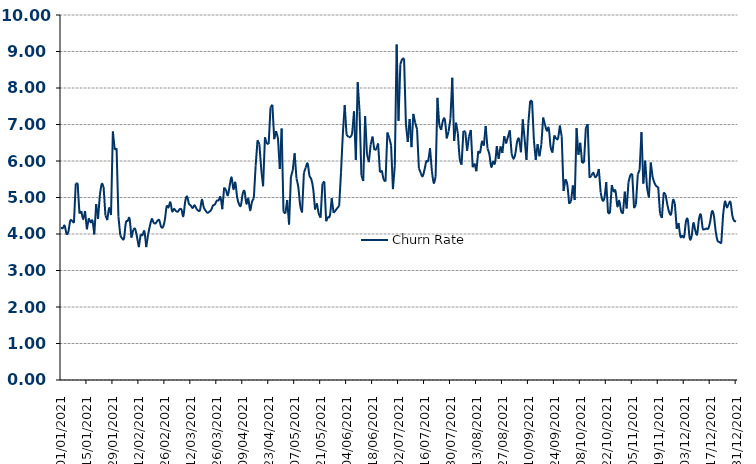
| Category | Churn Rate |
|---|---|
| 01/01/2021 | 4.17 |
| 02/01/2021 | 4.16 |
| 03/01/2021 | 4.23 |
| 04/01/2021 | 4.01 |
| 05/01/2021 | 4.06 |
| 06/01/2021 | 4.36 |
| 07/01/2021 | 4.36 |
| 08/01/2021 | 4.3 |
| 09/01/2021 | 5.38 |
| 10/01/2021 | 5.39 |
| 11/01/2021 | 4.56 |
| 12/01/2021 | 4.63 |
| 13/01/2021 | 4.4 |
| 14/01/2021 | 4.63 |
| 15/01/2021 | 4.13 |
| 16/01/2021 | 4.43 |
| 17/01/2021 | 4.32 |
| 18/01/2021 | 4.36 |
| 19/01/2021 | 3.99 |
| 20/01/2021 | 4.82 |
| 21/01/2021 | 4.41 |
| 22/01/2021 | 5.07 |
| 23/01/2021 | 5.37 |
| 24/01/2021 | 5.29 |
| 25/01/2021 | 4.51 |
| 26/01/2021 | 4.38 |
| 27/01/2021 | 4.71 |
| 28/01/2021 | 4.52 |
| 29/01/2021 | 6.81 |
| 30/01/2021 | 6.31 |
| 31/01/2021 | 6.35 |
| 01/02/2021 | 4.48 |
| 02/02/2021 | 3.96 |
| 03/02/2021 | 3.88 |
| 04/02/2021 | 3.88 |
| 05/02/2021 | 4.31 |
| 06/02/2021 | 4.36 |
| 07/02/2021 | 4.42 |
| 08/02/2021 | 3.9 |
| 09/02/2021 | 4.12 |
| 10/02/2021 | 4.14 |
| 11/02/2021 | 3.92 |
| 12/02/2021 | 3.64 |
| 13/02/2021 | 3.99 |
| 14/02/2021 | 3.97 |
| 15/02/2021 | 4.07 |
| 16/02/2021 | 3.64 |
| 17/02/2021 | 3.99 |
| 18/02/2021 | 4.23 |
| 19/02/2021 | 4.41 |
| 20/02/2021 | 4.31 |
| 21/02/2021 | 4.29 |
| 22/02/2021 | 4.36 |
| 23/02/2021 | 4.38 |
| 24/02/2021 | 4.2 |
| 25/02/2021 | 4.19 |
| 26/02/2021 | 4.38 |
| 27/02/2021 | 4.75 |
| 28/02/2021 | 4.73 |
| 01/03/2021 | 4.87 |
| 02/03/2021 | 4.62 |
| 03/03/2021 | 4.69 |
| 04/03/2021 | 4.63 |
| 05/03/2021 | 4.61 |
| 06/03/2021 | 4.68 |
| 07/03/2021 | 4.67 |
| 08/03/2021 | 4.49 |
| 09/03/2021 | 4.89 |
| 10/03/2021 | 5.03 |
| 11/03/2021 | 4.83 |
| 12/03/2021 | 4.78 |
| 13/03/2021 | 4.71 |
| 14/03/2021 | 4.79 |
| 15/03/2021 | 4.7 |
| 16/03/2021 | 4.64 |
| 17/03/2021 | 4.66 |
| 18/03/2021 | 4.94 |
| 19/03/2021 | 4.73 |
| 20/03/2021 | 4.64 |
| 21/03/2021 | 4.58 |
| 22/03/2021 | 4.61 |
| 23/03/2021 | 4.66 |
| 24/03/2021 | 4.78 |
| 25/03/2021 | 4.81 |
| 26/03/2021 | 4.91 |
| 27/03/2021 | 4.92 |
| 28/03/2021 | 5.01 |
| 29/03/2021 | 4.68 |
| 30/03/2021 | 5.27 |
| 31/03/2021 | 5.21 |
| 01/04/2021 | 5.06 |
| 02/04/2021 | 5.33 |
| 03/04/2021 | 5.55 |
| 04/04/2021 | 5.23 |
| 05/04/2021 | 5.41 |
| 06/04/2021 | 5.01 |
| 07/04/2021 | 4.82 |
| 08/04/2021 | 4.78 |
| 09/04/2021 | 5.1 |
| 10/04/2021 | 5.17 |
| 11/04/2021 | 4.83 |
| 12/04/2021 | 4.97 |
| 13/04/2021 | 4.65 |
| 14/04/2021 | 4.88 |
| 15/04/2021 | 4.98 |
| 16/04/2021 | 5.88 |
| 17/04/2021 | 6.57 |
| 18/04/2021 | 6.46 |
| 19/04/2021 | 5.79 |
| 20/04/2021 | 5.31 |
| 21/04/2021 | 6.65 |
| 22/04/2021 | 6.47 |
| 23/04/2021 | 6.47 |
| 24/04/2021 | 7.47 |
| 25/04/2021 | 7.54 |
| 26/04/2021 | 6.6 |
| 27/04/2021 | 6.82 |
| 28/04/2021 | 6.63 |
| 29/04/2021 | 5.78 |
| 30/04/2021 | 6.89 |
| 01/05/2021 | 4.61 |
| 02/05/2021 | 4.56 |
| 03/05/2021 | 4.93 |
| 04/05/2021 | 4.26 |
| 05/05/2021 | 5.56 |
| 06/05/2021 | 5.75 |
| 07/05/2021 | 6.21 |
| 08/05/2021 | 5.52 |
| 09/05/2021 | 5.28 |
| 10/05/2021 | 4.78 |
| 11/05/2021 | 4.59 |
| 12/05/2021 | 5.68 |
| 13/05/2021 | 5.82 |
| 14/05/2021 | 5.93 |
| 15/05/2021 | 5.6 |
| 16/05/2021 | 5.5 |
| 17/05/2021 | 5.24 |
| 18/05/2021 | 4.67 |
| 19/05/2021 | 4.84 |
| 20/05/2021 | 4.56 |
| 21/05/2021 | 4.45 |
| 22/05/2021 | 5.38 |
| 23/05/2021 | 5.44 |
| 24/05/2021 | 4.35 |
| 25/05/2021 | 4.47 |
| 26/05/2021 | 4.5 |
| 27/05/2021 | 4.98 |
| 28/05/2021 | 4.58 |
| 29/05/2021 | 4.64 |
| 30/05/2021 | 4.71 |
| 31/05/2021 | 4.77 |
| 01/06/2021 | 5.68 |
| 02/06/2021 | 6.74 |
| 03/06/2021 | 7.53 |
| 04/06/2021 | 6.72 |
| 05/06/2021 | 6.66 |
| 06/06/2021 | 6.66 |
| 07/06/2021 | 6.77 |
| 08/06/2021 | 7.36 |
| 09/06/2021 | 6.03 |
| 10/06/2021 | 8.16 |
| 11/06/2021 | 7.36 |
| 12/06/2021 | 5.61 |
| 13/06/2021 | 5.45 |
| 14/06/2021 | 7.23 |
| 15/06/2021 | 6.19 |
| 16/06/2021 | 5.97 |
| 17/06/2021 | 6.45 |
| 18/06/2021 | 6.67 |
| 19/06/2021 | 6.3 |
| 20/06/2021 | 6.33 |
| 21/06/2021 | 6.48 |
| 22/06/2021 | 5.69 |
| 23/06/2021 | 5.74 |
| 24/06/2021 | 5.5 |
| 25/06/2021 | 5.44 |
| 26/06/2021 | 6.78 |
| 27/06/2021 | 6.64 |
| 28/06/2021 | 6.43 |
| 29/06/2021 | 5.23 |
| 30/06/2021 | 5.87 |
| 01/07/2021 | 9.19 |
| 02/07/2021 | 7.1 |
| 03/07/2021 | 8.65 |
| 04/07/2021 | 8.8 |
| 05/07/2021 | 8.81 |
| 06/07/2021 | 7.01 |
| 07/07/2021 | 6.52 |
| 08/07/2021 | 7.15 |
| 09/07/2021 | 6.38 |
| 10/07/2021 | 7.29 |
| 11/07/2021 | 7.05 |
| 12/07/2021 | 6.87 |
| 13/07/2021 | 5.8 |
| 14/07/2021 | 5.67 |
| 15/07/2021 | 5.58 |
| 16/07/2021 | 5.76 |
| 17/07/2021 | 5.99 |
| 18/07/2021 | 6.01 |
| 19/07/2021 | 6.35 |
| 20/07/2021 | 5.72 |
| 21/07/2021 | 5.4 |
| 22/07/2021 | 5.57 |
| 23/07/2021 | 7.73 |
| 24/07/2021 | 6.98 |
| 25/07/2021 | 6.85 |
| 26/07/2021 | 7.11 |
| 27/07/2021 | 7.13 |
| 28/07/2021 | 6.62 |
| 29/07/2021 | 6.81 |
| 30/07/2021 | 7.16 |
| 31/07/2021 | 8.28 |
| 01/08/2021 | 6.55 |
| 02/08/2021 | 7.05 |
| 03/08/2021 | 6.76 |
| 04/08/2021 | 6.07 |
| 05/08/2021 | 5.9 |
| 06/08/2021 | 6.82 |
| 07/08/2021 | 6.81 |
| 08/08/2021 | 6.28 |
| 09/08/2021 | 6.67 |
| 10/08/2021 | 6.85 |
| 11/08/2021 | 5.83 |
| 12/08/2021 | 5.93 |
| 13/08/2021 | 5.72 |
| 14/08/2021 | 6.27 |
| 15/08/2021 | 6.24 |
| 16/08/2021 | 6.53 |
| 17/08/2021 | 6.42 |
| 18/08/2021 | 6.96 |
| 19/08/2021 | 6.34 |
| 20/08/2021 | 6.18 |
| 21/08/2021 | 5.84 |
| 22/08/2021 | 5.98 |
| 23/08/2021 | 5.94 |
| 24/08/2021 | 6.41 |
| 25/08/2021 | 6.06 |
| 26/08/2021 | 6.4 |
| 27/08/2021 | 6.22 |
| 28/08/2021 | 6.68 |
| 29/08/2021 | 6.48 |
| 30/08/2021 | 6.66 |
| 31/08/2021 | 6.84 |
| 01/09/2021 | 6.2 |
| 02/09/2021 | 6.06 |
| 03/09/2021 | 6.2 |
| 04/09/2021 | 6.54 |
| 05/09/2021 | 6.6 |
| 06/09/2021 | 6.24 |
| 07/09/2021 | 7.14 |
| 08/09/2021 | 6.6 |
| 09/09/2021 | 6.03 |
| 10/09/2021 | 7.03 |
| 11/09/2021 | 7.65 |
| 12/09/2021 | 7.65 |
| 13/09/2021 | 6.57 |
| 14/09/2021 | 6.03 |
| 15/09/2021 | 6.46 |
| 16/09/2021 | 6.13 |
| 17/09/2021 | 6.45 |
| 18/09/2021 | 7.19 |
| 19/09/2021 | 6.99 |
| 20/09/2021 | 6.83 |
| 21/09/2021 | 6.9 |
| 22/09/2021 | 6.39 |
| 23/09/2021 | 6.23 |
| 24/09/2021 | 6.7 |
| 25/09/2021 | 6.62 |
| 26/09/2021 | 6.62 |
| 27/09/2021 | 6.97 |
| 28/09/2021 | 6.67 |
| 29/09/2021 | 5.18 |
| 30/09/2021 | 5.5 |
| 01/10/2021 | 5.36 |
| 02/10/2021 | 4.83 |
| 03/10/2021 | 4.89 |
| 04/10/2021 | 5.33 |
| 05/10/2021 | 4.93 |
| 06/10/2021 | 6.9 |
| 07/10/2021 | 6.17 |
| 08/10/2021 | 6.5 |
| 09/10/2021 | 5.95 |
| 10/10/2021 | 5.96 |
| 11/10/2021 | 6.9 |
| 12/10/2021 | 7.01 |
| 13/10/2021 | 5.54 |
| 14/10/2021 | 5.6 |
| 15/10/2021 | 5.68 |
| 16/10/2021 | 5.56 |
| 17/10/2021 | 5.61 |
| 18/10/2021 | 5.78 |
| 19/10/2021 | 5.14 |
| 20/10/2021 | 4.92 |
| 21/10/2021 | 4.99 |
| 22/10/2021 | 5.42 |
| 23/10/2021 | 4.57 |
| 24/10/2021 | 4.57 |
| 25/10/2021 | 5.34 |
| 26/10/2021 | 5.15 |
| 27/10/2021 | 5.18 |
| 28/10/2021 | 4.76 |
| 29/10/2021 | 4.91 |
| 30/10/2021 | 4.63 |
| 31/10/2021 | 4.56 |
| 01/11/2021 | 5.16 |
| 02/11/2021 | 4.7 |
| 03/11/2021 | 5.42 |
| 04/11/2021 | 5.61 |
| 05/11/2021 | 5.65 |
| 06/11/2021 | 4.71 |
| 07/11/2021 | 4.81 |
| 08/11/2021 | 5.63 |
| 09/11/2021 | 5.76 |
| 10/11/2021 | 6.79 |
| 11/11/2021 | 5.38 |
| 12/11/2021 | 6.01 |
| 13/11/2021 | 5.26 |
| 14/11/2021 | 5 |
| 15/11/2021 | 5.96 |
| 16/11/2021 | 5.56 |
| 17/11/2021 | 5.4 |
| 18/11/2021 | 5.31 |
| 19/11/2021 | 5.29 |
| 20/11/2021 | 4.56 |
| 21/11/2021 | 4.44 |
| 22/11/2021 | 5.14 |
| 23/11/2021 | 5.08 |
| 24/11/2021 | 4.79 |
| 25/11/2021 | 4.59 |
| 26/11/2021 | 4.55 |
| 27/11/2021 | 4.93 |
| 28/11/2021 | 4.83 |
| 29/11/2021 | 4.14 |
| 30/11/2021 | 4.3 |
| 01/12/2021 | 3.93 |
| 02/12/2021 | 3.95 |
| 03/12/2021 | 3.93 |
| 04/12/2021 | 4.35 |
| 05/12/2021 | 4.38 |
| 06/12/2021 | 3.88 |
| 07/12/2021 | 3.93 |
| 08/12/2021 | 4.3 |
| 09/12/2021 | 4.1 |
| 10/12/2021 | 3.99 |
| 11/12/2021 | 4.41 |
| 12/12/2021 | 4.53 |
| 13/12/2021 | 4.16 |
| 14/12/2021 | 4.13 |
| 15/12/2021 | 4.15 |
| 16/12/2021 | 4.15 |
| 17/12/2021 | 4.33 |
| 18/12/2021 | 4.62 |
| 19/12/2021 | 4.51 |
| 20/12/2021 | 4.08 |
| 21/12/2021 | 3.82 |
| 22/12/2021 | 3.78 |
| 23/12/2021 | 3.74 |
| 24/12/2021 | 4.52 |
| 25/12/2021 | 4.89 |
| 26/12/2021 | 4.73 |
| 27/12/2021 | 4.82 |
| 28/12/2021 | 4.87 |
| 29/12/2021 | 4.5 |
| 30/12/2021 | 4.36 |
| 31/12/2021 | 4.35 |